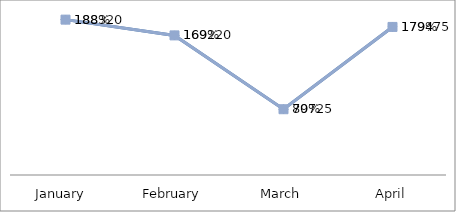
| Category | PROFIT | PERCENTAGE |
|---|---|---|
| January  | 188320 | 1.883 |
| February | 169220 | 1.692 |
| March | 79725 | 0.797 |
| April | 179475 | 1.795 |